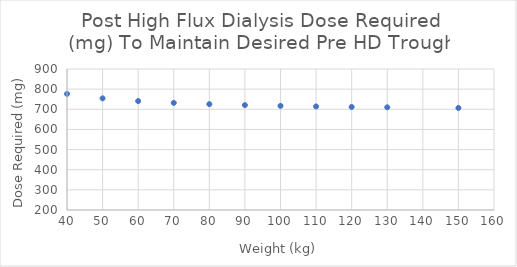
| Category | Series 0 |
|---|---|
| 40.0 | 776.395 |
| 50.0 | 754.265 |
| 60.0 | 740.854 |
| 70.0 | 731.904 |
| 80.0 | 725.525 |
| 90.0 | 720.758 |
| 100.0 | 717.065 |
| 110.0 | 714.121 |
| 120.0 | 711.721 |
| 130.0 | 709.729 |
| 150.0 | 706.611 |